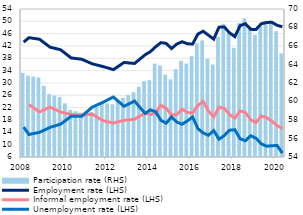
| Category | Participation rate (RHS) |
|---|---|
| 2008 | 63.1 |
| II | 62.8 |
| III | 62.7 |
| IV | 62.6 |
| 2009 | 61.7 |
| II | 60.8 |
| III | 60.65 |
| IV | 60.5 |
| 2010 | 59.8 |
| II | 59.1 |
| III | 58.95 |
| IV | 58.8 |
| 2011 | 58.85 |
| II | 58.9 |
| III | 59.4 |
| IV | 59.9 |
| 2012 | 59.8 |
| II | 59.7 |
| III | 60.05 |
| IV | 60.4 |
| 2013 | 60.7 |
| II | 61 |
| III | 61.6 |
| IV | 62.2 |
| 2014 | 62.3 |
| II | 64.1 |
| III | 63.9 |
| IV | 62.9 |
| 2015 | 62.4 |
| II | 63.5 |
| III | 64.4 |
| IV | 64.1 |
| 2016 | 64.9 |
| II | 66.3 |
| III | 66.6 |
| IV | 64.6 |
| 2017 | 64 |
| II | 67 |
| III | 68.4 |
| IV | 67.4 |
| 2018 | 65.8 |
| II | 68.5 |
| III | 69 |
| IV | 68.1 |
| 2019 | 67.2 |
| II | 68.2 |
| III | 68.4 |
| IV | 68.7 |
| 2020 | 67.6 |
| II | 65.2 |